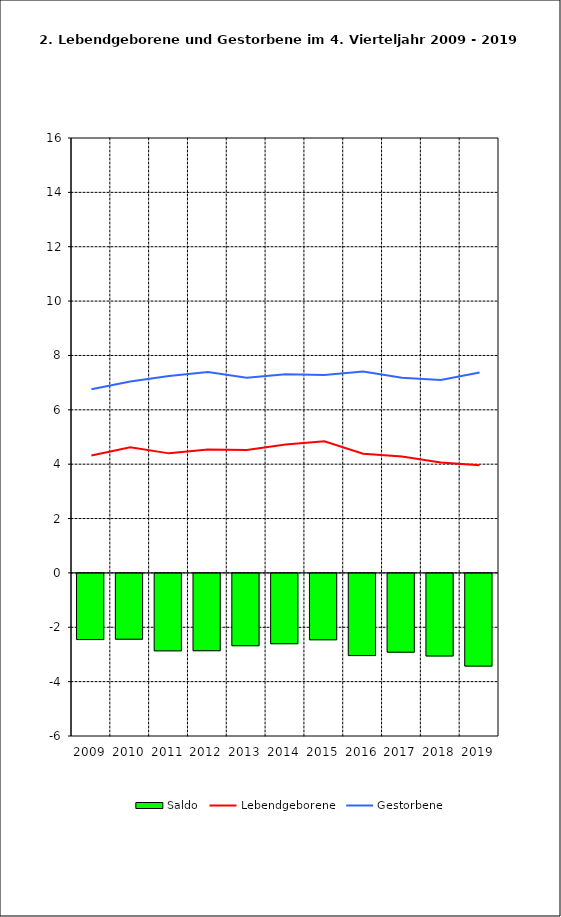
| Category | Saldo |
|---|---|
| 2009.0 | -2.435 |
| 2010.0 | -2.421 |
| 2011.0 | -2.849 |
| 2012.0 | -2.844 |
| 2013.0 | -2.66 |
| 2014.0 | -2.587 |
| 2015.0 | -2.442 |
| 2016.0 | -3.024 |
| 2017.0 | -2.898 |
| 2018.0 | -3.038 |
| 2019.0 | -3.41 |